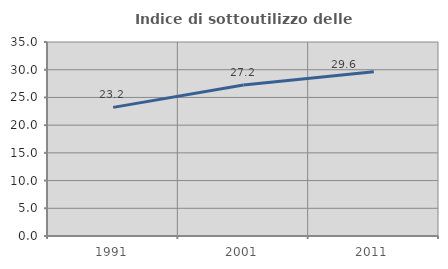
| Category | Indice di sottoutilizzo delle abitazioni  |
|---|---|
| 1991.0 | 23.205 |
| 2001.0 | 27.225 |
| 2011.0 | 29.63 |